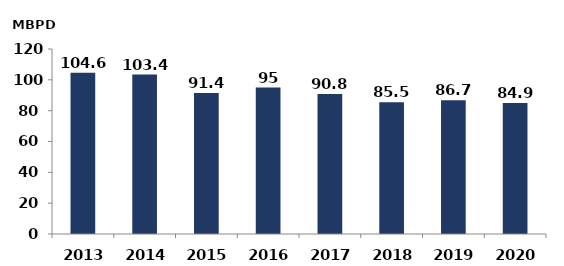
| Category | Series 0 |
|---|---|
| 2013.0 | 104.6 |
| 2014.0 | 103.4 |
| 2015.0 | 91.4 |
| 2016.0 | 95 |
| 2017.0 | 90.8 |
| 2018.0 | 85.5 |
| 2019.0 | 86.737 |
| 2020.0 | 84.945 |